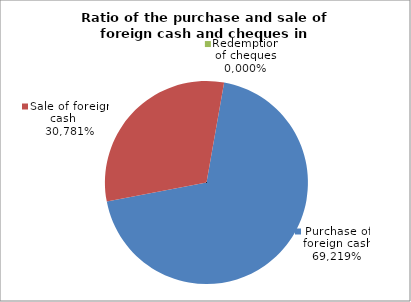
| Category | Purchase of foreign cash |
|---|---|
| 0 | 0.692 |
| 1 | 0.308 |
| 2 | 0 |